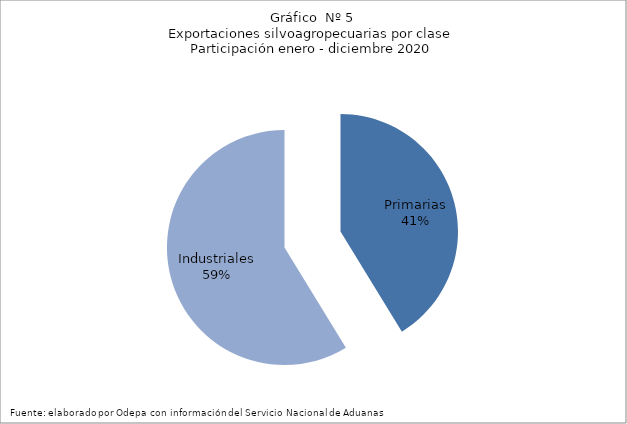
| Category | Series 0 |
|---|---|
| Primarias | 6474465 |
| Industriales | 9221977 |